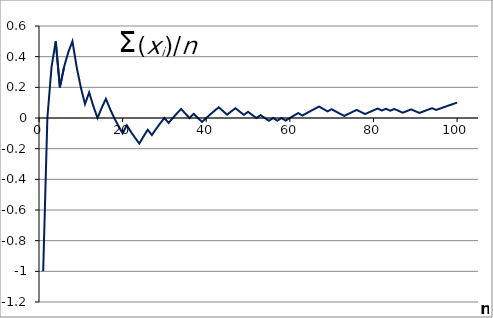
| Category | "Szum(xi)/n" |
|---|---|
| 1.0 | -1 |
| 2.0 | 0 |
| 3.0 | 0.333 |
| 4.0 | 0.5 |
| 5.0 | 0.2 |
| 6.0 | 0.333 |
| 7.0 | 0.429 |
| 8.0 | 0.5 |
| 9.0 | 0.333 |
| 10.0 | 0.2 |
| 11.0 | 0.091 |
| 12.0 | 0.167 |
| 13.0 | 0.077 |
| 14.0 | 0 |
| 15.0 | 0.067 |
| 16.0 | 0.125 |
| 17.0 | 0.059 |
| 18.0 | 0 |
| 19.0 | -0.053 |
| 20.0 | -0.1 |
| 21.0 | -0.048 |
| 22.0 | -0.091 |
| 23.0 | -0.13 |
| 24.0 | -0.167 |
| 25.0 | -0.12 |
| 26.0 | -0.077 |
| 27.0 | -0.111 |
| 28.0 | -0.071 |
| 29.0 | -0.034 |
| 30.0 | 0 |
| 31.0 | -0.032 |
| 32.0 | 0 |
| 33.0 | 0.03 |
| 34.0 | 0.059 |
| 35.0 | 0.029 |
| 36.0 | 0 |
| 37.0 | 0.027 |
| 38.0 | 0 |
| 39.0 | -0.026 |
| 40.0 | 0 |
| 41.0 | 0.024 |
| 42.0 | 0.048 |
| 43.0 | 0.07 |
| 44.0 | 0.045 |
| 45.0 | 0.022 |
| 46.0 | 0.043 |
| 47.0 | 0.064 |
| 48.0 | 0.042 |
| 49.0 | 0.02 |
| 50.0 | 0.04 |
| 51.0 | 0.02 |
| 52.0 | 0 |
| 53.0 | 0.019 |
| 54.0 | 0 |
| 55.0 | -0.018 |
| 56.0 | 0 |
| 57.0 | -0.018 |
| 58.0 | 0 |
| 59.0 | -0.017 |
| 60.0 | 0 |
| 61.0 | 0.016 |
| 62.0 | 0.032 |
| 63.0 | 0.016 |
| 64.0 | 0.031 |
| 65.0 | 0.046 |
| 66.0 | 0.061 |
| 67.0 | 0.075 |
| 68.0 | 0.059 |
| 69.0 | 0.043 |
| 70.0 | 0.057 |
| 71.0 | 0.042 |
| 72.0 | 0.028 |
| 73.0 | 0.014 |
| 74.0 | 0.027 |
| 75.0 | 0.04 |
| 76.0 | 0.053 |
| 77.0 | 0.039 |
| 78.0 | 0.026 |
| 79.0 | 0.038 |
| 80.0 | 0.05 |
| 81.0 | 0.062 |
| 82.0 | 0.049 |
| 83.0 | 0.06 |
| 84.0 | 0.048 |
| 85.0 | 0.059 |
| 86.0 | 0.047 |
| 87.0 | 0.034 |
| 88.0 | 0.045 |
| 89.0 | 0.056 |
| 90.0 | 0.044 |
| 91.0 | 0.033 |
| 92.0 | 0.043 |
| 93.0 | 0.054 |
| 94.0 | 0.064 |
| 95.0 | 0.053 |
| 96.0 | 0.062 |
| 97.0 | 0.072 |
| 98.0 | 0.082 |
| 99.0 | 0.091 |
| 100.0 | 0.1 |